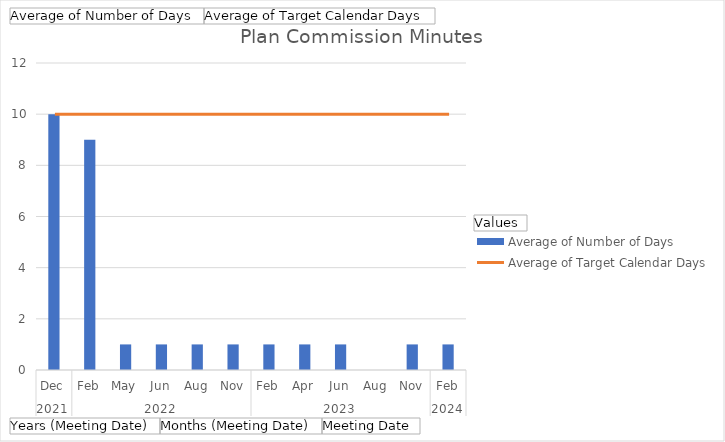
| Category | Average of Number of Days |
|---|---|
| 0 | 10 |
| 1 | 9 |
| 2 | 1 |
| 3 | 1 |
| 4 | 1 |
| 5 | 1 |
| 6 | 1 |
| 7 | 1 |
| 8 | 1 |
| 9 | 0 |
| 10 | 1 |
| 11 | 1 |